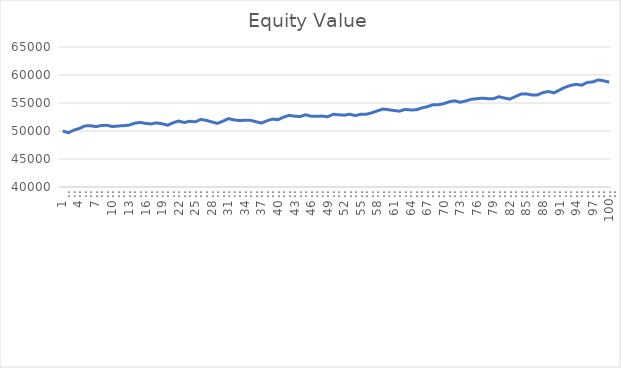
| Category | Equity Value |
|---|---|
| 0 | 50000 |
| 1 | 49676 |
| 2 | 50151 |
| 3 | 50449 |
| 4 | 50903 |
| 5 | 50957 |
| 6 | 50773 |
| 7 | 50978 |
| 8 | 51025 |
| 9 | 50786 |
| 10 | 50896 |
| 11 | 50949 |
| 12 | 51047 |
| 13 | 51389 |
| 14 | 51527 |
| 15 | 51359 |
| 16 | 51258 |
| 17 | 51455 |
| 18 | 51286 |
| 19 | 51037 |
| 20 | 51473 |
| 21 | 51787 |
| 22 | 51512 |
| 23 | 51741 |
| 24 | 51630 |
| 25 | 52060 |
| 26 | 51905 |
| 27 | 51617 |
| 28 | 51371 |
| 29 | 51742 |
| 30 | 52213 |
| 31 | 51983 |
| 32 | 51867 |
| 33 | 51920 |
| 34 | 51919 |
| 35 | 51650 |
| 36 | 51423 |
| 37 | 51829 |
| 38 | 52124 |
| 39 | 52024 |
| 40 | 52478 |
| 41 | 52796 |
| 42 | 52650 |
| 43 | 52585 |
| 44 | 52894 |
| 45 | 52633 |
| 46 | 52639 |
| 47 | 52661 |
| 48 | 52542 |
| 49 | 52988 |
| 50 | 52895 |
| 51 | 52824 |
| 52 | 53003 |
| 53 | 52746 |
| 54 | 52992 |
| 55 | 53001 |
| 56 | 53248 |
| 57 | 53596 |
| 58 | 53917 |
| 59 | 53802 |
| 60 | 53663 |
| 61 | 53541 |
| 62 | 53849 |
| 63 | 53768 |
| 64 | 53774 |
| 65 | 54101 |
| 66 | 54328 |
| 67 | 54668 |
| 68 | 54672 |
| 69 | 54872 |
| 70 | 55220 |
| 71 | 55386 |
| 72 | 55137 |
| 73 | 55356 |
| 74 | 55664 |
| 75 | 55756 |
| 76 | 55867 |
| 77 | 55773 |
| 78 | 55747 |
| 79 | 56128 |
| 80 | 55886 |
| 81 | 55701 |
| 82 | 56141 |
| 83 | 56597 |
| 84 | 56625 |
| 85 | 56435 |
| 86 | 56450 |
| 87 | 56858 |
| 88 | 57050 |
| 89 | 56818 |
| 90 | 57313 |
| 91 | 57800 |
| 92 | 58134 |
| 93 | 58337 |
| 94 | 58179 |
| 95 | 58674 |
| 96 | 58755 |
| 97 | 59119 |
| 98 | 58971 |
| 99 | 58715 |